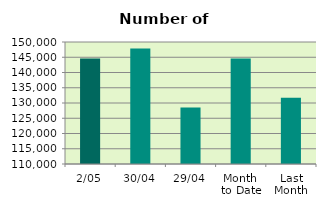
| Category | Series 0 |
|---|---|
| 2/05 | 144556 |
| 30/04 | 147852 |
| 29/04 | 128538 |
| Month 
to Date | 144556 |
| Last
Month | 131708.5 |